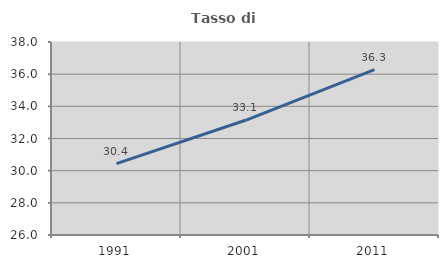
| Category | Tasso di occupazione   |
|---|---|
| 1991.0 | 30.441 |
| 2001.0 | 33.133 |
| 2011.0 | 36.28 |